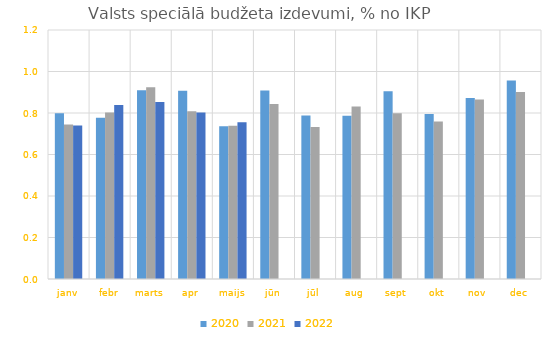
| Category | 2020 | 2021 | 2022 |
|---|---|---|---|
| janv | 0.799 | 0.744 | 0.739 |
| febr | 0.777 | 0.802 | 0.839 |
| marts | 0.91 | 0.924 | 0.853 |
| apr | 0.908 | 0.809 | 0.802 |
| maijs | 0.736 | 0.739 | 0.756 |
| jūn | 0.909 | 0.844 | 0 |
| jūl | 0.787 | 0.732 | 0 |
| aug | 0.786 | 0.831 | 0 |
| sept | 0.904 | 0.799 | 0 |
| okt | 0.795 | 0.759 | 0 |
| nov | 0.873 | 0.866 | 0 |
| dec | 0.957 | 0.901 | 0 |